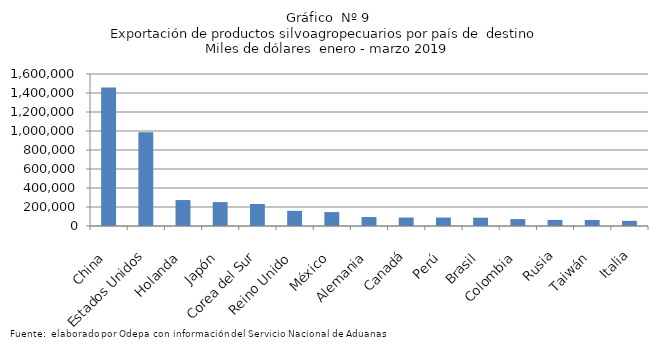
| Category | Series 0 |
|---|---|
| China | 1457808.498 |
| Estados Unidos | 986590.96 |
| Holanda | 273170.8 |
| Japón | 251820.392 |
| Corea del Sur | 231330.503 |
| Reino Unido | 159731.567 |
| México | 146625.274 |
| Alemania | 94380.852 |
| Canadá | 89134.832 |
| Perú | 88887.791 |
| Brasil | 87612.674 |
| Colombia | 72588.141 |
| Rusia | 63950.158 |
| Taiwán | 63586.512 |
| Italia | 54190.164 |